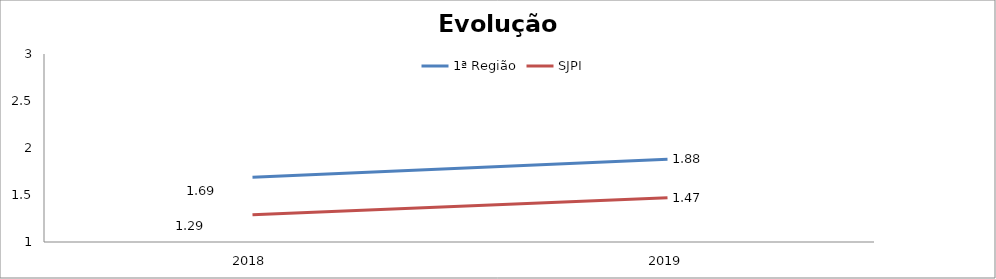
| Category | 1ª Região | SJPI |
|---|---|---|
| 2018.0 | 1.69 | 1.29 |
| 2019.0 | 1.88 | 1.47 |